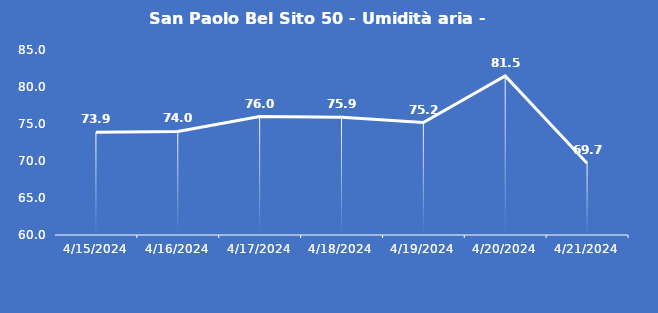
| Category | San Paolo Bel Sito 50 - Umidità aria - Grezzo (%) |
|---|---|
| 4/15/24 | 73.9 |
| 4/16/24 | 74 |
| 4/17/24 | 76 |
| 4/18/24 | 75.9 |
| 4/19/24 | 75.2 |
| 4/20/24 | 81.5 |
| 4/21/24 | 69.7 |